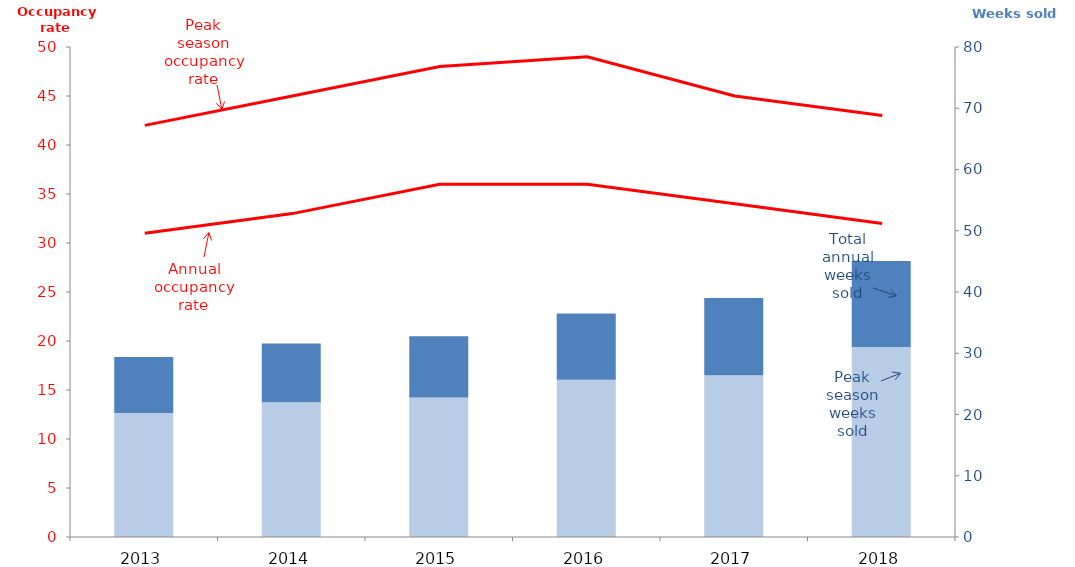
| Category | pkwk | week |
|---|---|---|
| 2013.0 | 20247.634 | 9151.64 |
| 2014.0 | 21989 | 9621 |
| 2015.0 | 22792.189 | 9992.811 |
| 2016.0 | 25662.37 | 10831.2 |
| 2017.0 | 26420.976 | 12602.533 |
| 2018.0 | 31037.646 | 14031.131 |